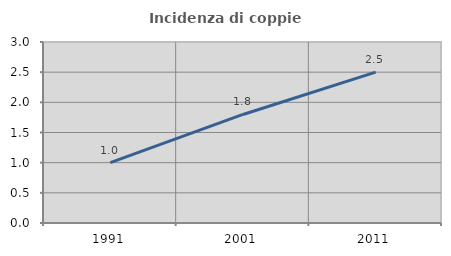
| Category | Incidenza di coppie miste |
|---|---|
| 1991.0 | 1.001 |
| 2001.0 | 1.799 |
| 2011.0 | 2.501 |